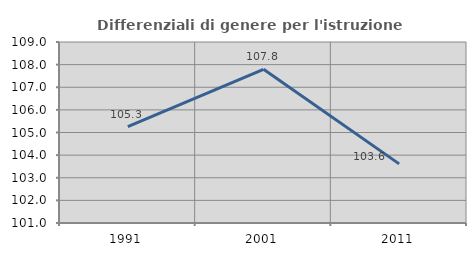
| Category | Differenziali di genere per l'istruzione superiore |
|---|---|
| 1991.0 | 105.262 |
| 2001.0 | 107.793 |
| 2011.0 | 103.613 |